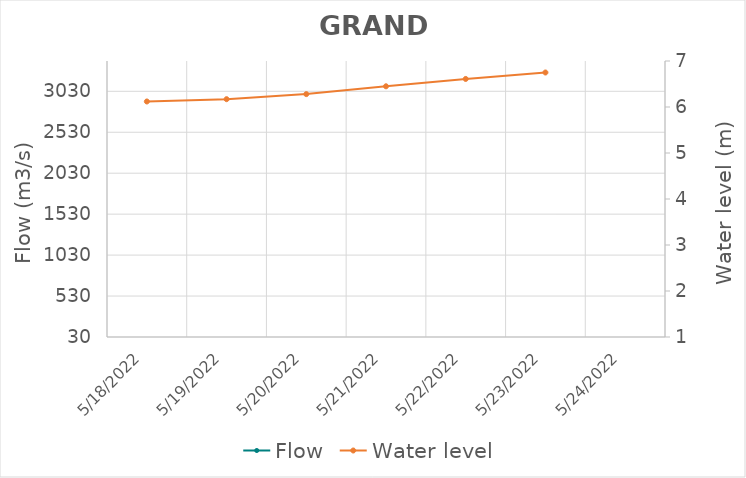
| Category | Flow |
|---|---|
| 4/26/22 | 3205.71 |
| 4/25/22 | 3076.9 |
| 4/24/22 | 3022.48 |
| 4/23/22 | 2956.02 |
| 4/22/22 | 2862.73 |
| 4/21/22 | 2621.07 |
| 4/20/22 | 2679.31 |